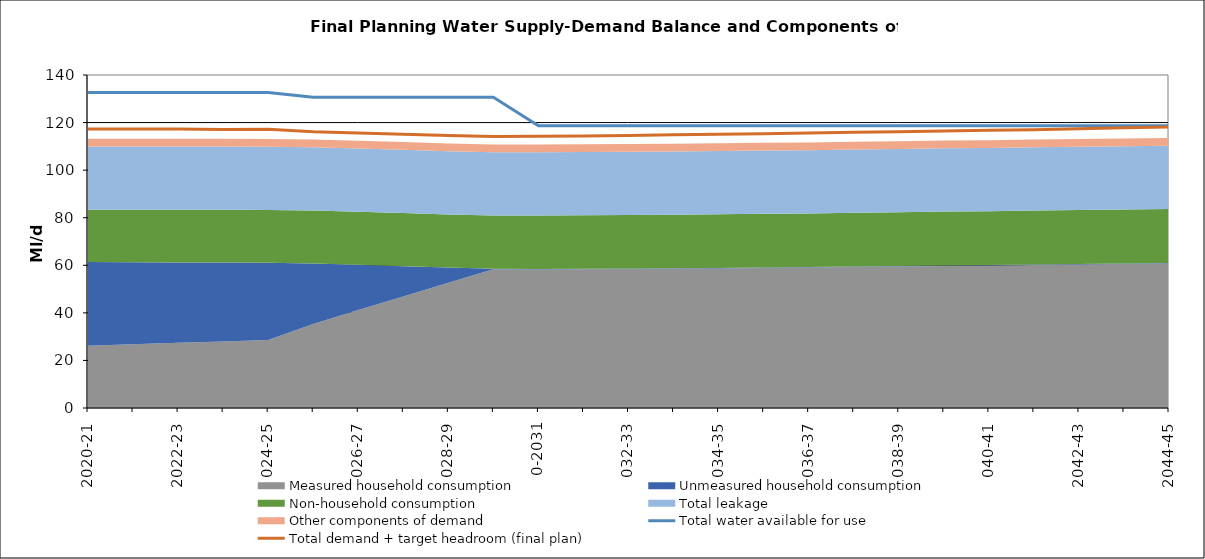
| Category | Total water available for use | Total demand + target headroom (final plan) |
|---|---|---|
| 0 | 132.632 | 117.307 |
| 1 | 132.632 | 117.307 |
| 2 | 132.632 | 117.323 |
| 3 | 132.632 | 117.073 |
| 4 | 132.632 | 117.157 |
| 5 | 130.632 | 116.16 |
| 6 | 130.632 | 115.642 |
| 7 | 130.632 | 115.072 |
| 8 | 130.632 | 114.541 |
| 9 | 130.632 | 114.145 |
| 10 | 118.632 | 114.209 |
| 11 | 118.632 | 114.308 |
| 12 | 118.632 | 114.536 |
| 13 | 118.632 | 114.86 |
| 14 | 118.632 | 115.09 |
| 15 | 118.632 | 115.282 |
| 16 | 118.632 | 115.612 |
| 17 | 118.632 | 115.939 |
| 18 | 118.632 | 116.097 |
| 19 | 118.632 | 116.43 |
| 20 | 118.632 | 116.733 |
| 21 | 118.632 | 117.002 |
| 22 | 118.632 | 117.355 |
| 23 | 118.632 | 117.786 |
| 24 | 118.632 | 118.115 |